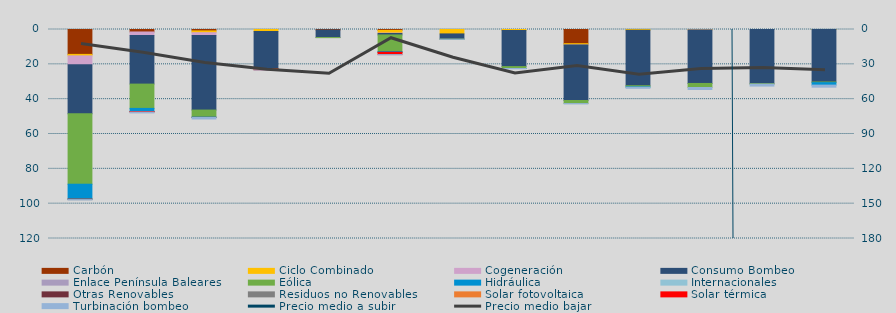
| Category | Carbón | Ciclo Combinado | Cogeneración | Consumo Bombeo | Enlace Península Baleares | Eólica | Hidráulica | Internacionales | Otras Renovables | Residuos no Renovables | Solar fotovoltaica | Solar térmica | Turbinación bombeo |
|---|---|---|---|---|---|---|---|---|---|---|---|---|---|
| 0 | 14289.6 | 859.1 | 5068.8 | 28184.1 | 0 | 40432 | 8486.1 |  | 49.4 | 334.8 | 0 | 0 | 110.8 |
| 1 | 1420.9 | 0 | 2008.3 | 27920 | 0 | 13960.1 | 1762.8 |  | 22.7 | 98.3 | 0 | 224.2 | 474.7 |
| 2 | 808.2 | 1016.6 | 1618.6 | 42815.3 | 0 | 4070.8 | 105.9 |  | 51.2 | 12.8 | 0 | 0 | 879 |
| 3 | 0 | 1097.9 | 0 | 21404.4 | 0 | 137.4 | 0 |  | 0 | 0 | 0 | 518.8 | 108.8 |
| 4 | 294.2 | 0 | 0 | 4310.8 | 42.4 | 0.6 | 0 |  | 0 | 0 | 0 | 0 | 0 |
| 5 | 516.7 | 1537.9 | 257 | 809.6 | 0 | 9502.9 | 408.7 |  | 117.5 | 0 | 0.4 | 1254.7 | 102.9 |
| 6 | 0 | 2533.1 | 0 | 2991.4 | 0 | 42.6 | 0 |  | 0 | 0 | 0 | 0 | 65 |
| 7 | 0 | 555.8 | 0 | 20748.5 | 0 | 1071 | 8.2 |  | 0 | 0 | 0 | 0 | 183.2 |
| 8 | 8149.5 | 754.8 | 3.5 | 31856.3 | 0 | 1760.6 | 0 |  | 0 | 0 | 0 | 0 | 177.8 |
| 9 | 0 | 458.3 | 0 | 31829.7 | 0 | 671.7 | 189.5 |  | 0 | 0 | 0 | 0 | 613.5 |
| 10 | 0 | 223.8 | 2.4 | 30752.2 | 0 | 2324.3 | 0 |  | 0 | 0 | 0 | 0 | 1135.9 |
| 11 | 0 | 0 | 0 | 31097.5 | 0 | 268.5 | 0 |  | 0 | 0 | 0 | 0 | 1121.8 |
| 12 | 0 | 20 | 0 | 30123.6 | 0 | 373.8 | 1416.6 |  | 0 | 0 | 0 | 0 | 1190.9 |